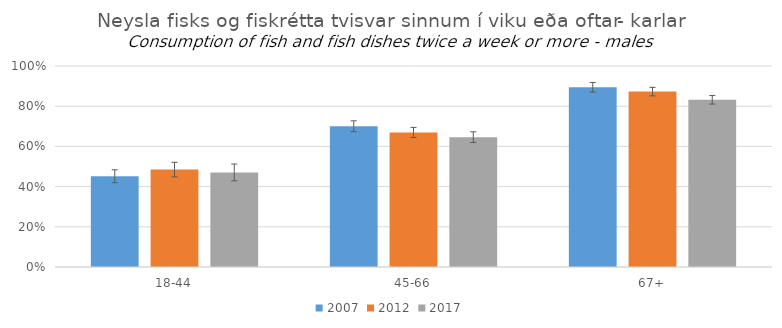
| Category | 2007 | 2012 | 2017 |
|---|---|---|---|
| 18-44 | 0.451 | 0.485 | 0.47 |
| 45-66 | 0.7 | 0.669 | 0.646 |
| 67+ | 0.894 | 0.873 | 0.832 |